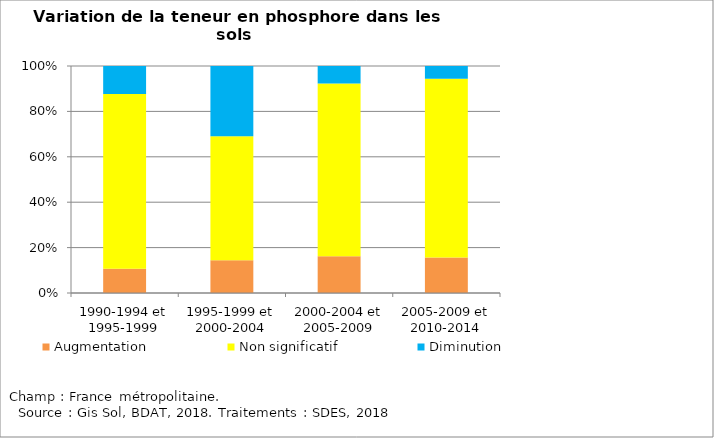
| Category | Augmentation | Non significatif | Diminution |
|---|---|---|---|
| 1990-1994 et 1995-1999 | 0.107 | 0.77 | 0.124 |
| 1995-1999 et 2000-2004 | 0.145 | 0.546 | 0.309 |
| 2000-2004 et 2005-2009 | 0.162 | 0.762 | 0.077 |
| 2005-2009 et 2010-2014 | 0.156 | 0.788 | 0.056 |